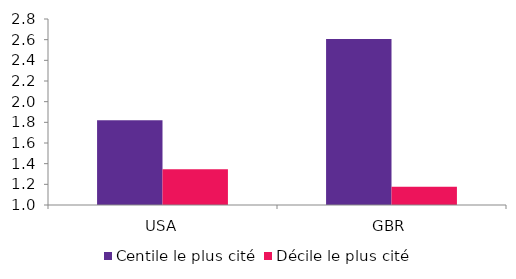
| Category | Centile le plus cité | Décile le plus cité |
|---|---|---|
| USA | 1.821 | 1.345 |
| GBR | 2.607 | 1.176 |